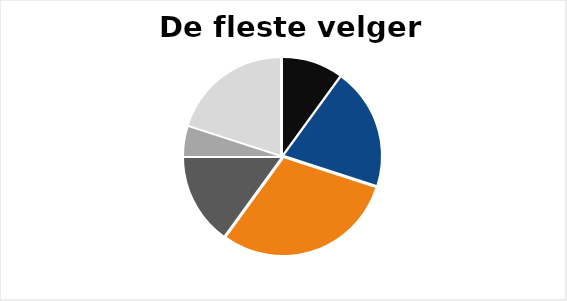
| Category | Series 0 |
|---|---|
| Epler | 0.1 |
| Appelsiner | 0.2 |
| Pærer | 0.3 |
| Annanas | 0.15 |
| Banan | 0.05 |
| Druer | 0.2 |